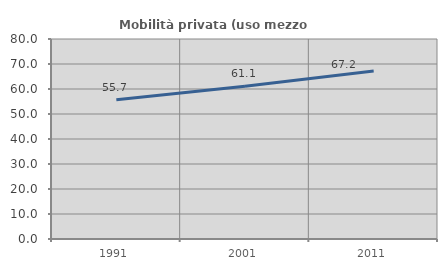
| Category | Mobilità privata (uso mezzo privato) |
|---|---|
| 1991.0 | 55.743 |
| 2001.0 | 61.061 |
| 2011.0 | 67.174 |